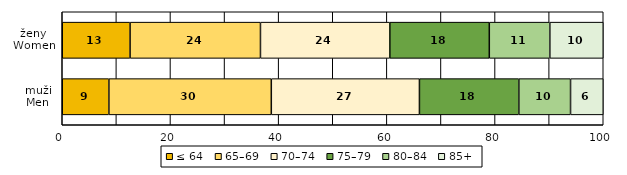
| Category | ≤ 64 | 65–69 | 70–74 | 75–79 | 80–84 | 85+ |
|---|---|---|---|---|---|---|
| muži
Men | 8.621 | 30.02 | 27.38 | 18.376 | 9.556 | 6.047 |
| ženy
Women | 12.535 | 24.103 | 23.915 | 18.386 | 11.187 | 9.874 |